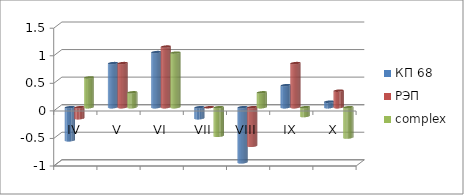
| Category | КП 68 | РЭП  | complex |
|---|---|---|---|
| IV | -0.6 | -0.2 | 0.54 |
| V | 0.8 | 0.8 | 0.27 |
| VI | 1 | 1.1 | 0.99 |
| VII | -0.2 | 0 | -0.52 |
| VIII | -1 | -0.7 | 0.27 |
| IX | 0.4 | 0.8 | -0.16 |
| X | 0.1 | 0.3 | -0.55 |